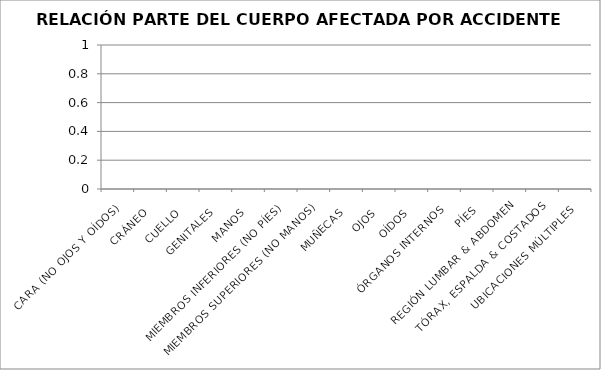
| Category | CANTIDAD |
|---|---|
| CARA (NO OJOS Y OÍDOS) | 0 |
| CRÁNEO | 0 |
| CUELLO | 0 |
| GENITALES | 0 |
| MANOS | 0 |
| MIEMBROS INFERIORES (NO PÍES) | 0 |
| MIEMBROS SUPERIORES (NO MANOS) | 0 |
| MUÑECAS | 0 |
| OJOS | 0 |
| OÍDOS | 0 |
| ÓRGANOS INTERNOS | 0 |
| PÍES | 0 |
| REGIÓN LUMBAR & ABDOMEN | 0 |
| TÓRAX, ESPALDA & COSTADOS | 0 |
| UBICACIONES MÚLTIPLES | 0 |